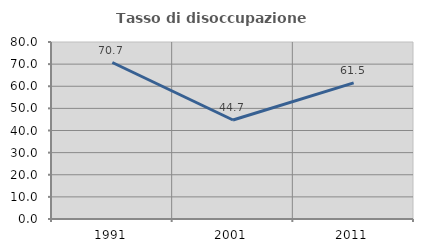
| Category | Tasso di disoccupazione giovanile  |
|---|---|
| 1991.0 | 70.732 |
| 2001.0 | 44.737 |
| 2011.0 | 61.538 |